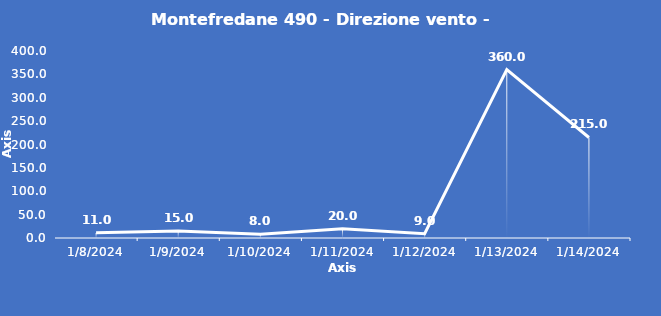
| Category | Montefredane 490 - Direzione vento - Grezzo (°N) |
|---|---|
| 1/8/24 | 11 |
| 1/9/24 | 15 |
| 1/10/24 | 8 |
| 1/11/24 | 20 |
| 1/12/24 | 9 |
| 1/13/24 | 360 |
| 1/14/24 | 215 |